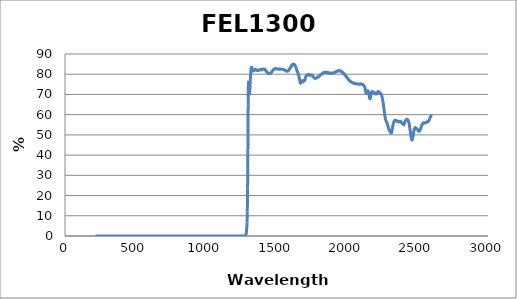
| Category | Series 0 |
|---|---|
| 2600.0 | 59.969 |
| 2599.0 | 59.881 |
| 2598.0 | 59.73 |
| 2597.0 | 59.598 |
| 2596.0 | 59.55 |
| 2595.0 | 59.393 |
| 2594.0 | 59.216 |
| 2593.0 | 59.158 |
| 2592.0 | 58.929 |
| 2591.0 | 58.817 |
| 2590.0 | 58.673 |
| 2589.0 | 58.438 |
| 2588.0 | 58.28 |
| 2587.0 | 58.122 |
| 2586.0 | 57.94 |
| 2585.0 | 57.652 |
| 2584.0 | 57.515 |
| 2583.0 | 57.382 |
| 2582.0 | 57.18 |
| 2581.0 | 57.008 |
| 2580.0 | 56.965 |
| 2579.0 | 56.839 |
| 2578.0 | 56.712 |
| 2577.0 | 56.682 |
| 2576.0 | 56.674 |
| 2575.0 | 56.623 |
| 2574.0 | 56.578 |
| 2573.0 | 56.587 |
| 2572.0 | 56.563 |
| 2571.0 | 56.522 |
| 2570.0 | 56.507 |
| 2569.0 | 56.46 |
| 2568.0 | 56.471 |
| 2567.0 | 56.363 |
| 2566.0 | 56.339 |
| 2565.0 | 56.24 |
| 2564.0 | 56.202 |
| 2563.0 | 56.131 |
| 2562.0 | 56.168 |
| 2561.0 | 56.062 |
| 2560.0 | 55.98 |
| 2559.0 | 56.016 |
| 2558.0 | 55.999 |
| 2557.0 | 55.931 |
| 2556.0 | 55.889 |
| 2555.0 | 55.826 |
| 2554.0 | 55.826 |
| 2553.0 | 55.825 |
| 2552.0 | 55.808 |
| 2551.0 | 55.839 |
| 2550.0 | 55.875 |
| 2549.0 | 55.958 |
| 2548.0 | 55.997 |
| 2547.0 | 56.031 |
| 2546.0 | 56.074 |
| 2545.0 | 55.976 |
| 2544.0 | 56.022 |
| 2543.0 | 55.931 |
| 2542.0 | 55.96 |
| 2541.0 | 55.912 |
| 2540.0 | 55.892 |
| 2539.0 | 55.846 |
| 2538.0 | 55.738 |
| 2537.0 | 55.578 |
| 2536.0 | 55.539 |
| 2535.0 | 55.359 |
| 2534.0 | 55.228 |
| 2533.0 | 55.102 |
| 2532.0 | 55.036 |
| 2531.0 | 54.741 |
| 2530.0 | 54.552 |
| 2529.0 | 54.396 |
| 2528.0 | 54.183 |
| 2527.0 | 53.971 |
| 2526.0 | 53.848 |
| 2525.0 | 53.608 |
| 2524.0 | 53.431 |
| 2523.0 | 53.211 |
| 2522.0 | 53.046 |
| 2521.0 | 52.83 |
| 2520.0 | 52.625 |
| 2519.0 | 52.514 |
| 2518.0 | 52.347 |
| 2517.0 | 52.14 |
| 2516.0 | 52.04 |
| 2515.0 | 51.996 |
| 2514.0 | 51.841 |
| 2513.0 | 51.81 |
| 2512.0 | 51.82 |
| 2511.0 | 51.808 |
| 2510.0 | 51.718 |
| 2509.0 | 51.867 |
| 2508.0 | 51.843 |
| 2507.0 | 51.906 |
| 2506.0 | 52 |
| 2505.0 | 52.163 |
| 2504.0 | 52.18 |
| 2503.0 | 52.311 |
| 2502.0 | 52.445 |
| 2501.0 | 52.564 |
| 2500.0 | 52.611 |
| 2499.0 | 52.815 |
| 2498.0 | 52.798 |
| 2497.0 | 52.827 |
| 2496.0 | 52.943 |
| 2495.0 | 53.031 |
| 2494.0 | 53.077 |
| 2493.0 | 53.136 |
| 2492.0 | 53.252 |
| 2491.0 | 53.287 |
| 2490.0 | 53.289 |
| 2489.0 | 53.346 |
| 2488.0 | 53.459 |
| 2487.0 | 53.51 |
| 2486.0 | 53.574 |
| 2485.0 | 53.62 |
| 2484.0 | 53.605 |
| 2483.0 | 53.625 |
| 2482.0 | 53.554 |
| 2481.0 | 53.421 |
| 2480.0 | 53.341 |
| 2479.0 | 53.196 |
| 2478.0 | 52.953 |
| 2477.0 | 52.672 |
| 2476.0 | 52.394 |
| 2475.0 | 52.086 |
| 2474.0 | 51.713 |
| 2473.0 | 51.368 |
| 2472.0 | 50.954 |
| 2471.0 | 50.538 |
| 2470.0 | 50.138 |
| 2469.0 | 49.689 |
| 2468.0 | 49.165 |
| 2467.0 | 48.781 |
| 2466.0 | 48.403 |
| 2465.0 | 48.04 |
| 2464.0 | 47.715 |
| 2463.0 | 47.569 |
| 2462.0 | 47.487 |
| 2461.0 | 47.418 |
| 2460.0 | 47.554 |
| 2459.0 | 47.681 |
| 2458.0 | 47.966 |
| 2457.0 | 48.254 |
| 2456.0 | 48.638 |
| 2455.0 | 48.997 |
| 2454.0 | 49.402 |
| 2453.0 | 49.834 |
| 2452.0 | 50.287 |
| 2451.0 | 50.713 |
| 2450.0 | 51.224 |
| 2449.0 | 51.66 |
| 2448.0 | 52.128 |
| 2447.0 | 52.722 |
| 2446.0 | 53.116 |
| 2445.0 | 53.648 |
| 2444.0 | 54.1 |
| 2443.0 | 54.54 |
| 2442.0 | 54.976 |
| 2441.0 | 55.451 |
| 2440.0 | 55.752 |
| 2439.0 | 56.04 |
| 2438.0 | 56.332 |
| 2437.0 | 56.609 |
| 2436.0 | 56.739 |
| 2435.0 | 56.986 |
| 2434.0 | 57.193 |
| 2433.0 | 57.212 |
| 2432.0 | 57.391 |
| 2431.0 | 57.506 |
| 2430.0 | 57.528 |
| 2429.0 | 57.62 |
| 2428.0 | 57.69 |
| 2427.0 | 57.651 |
| 2426.0 | 57.628 |
| 2425.0 | 57.659 |
| 2424.0 | 57.682 |
| 2423.0 | 57.717 |
| 2422.0 | 57.6 |
| 2421.0 | 57.593 |
| 2420.0 | 57.501 |
| 2419.0 | 57.502 |
| 2418.0 | 57.408 |
| 2417.0 | 57.316 |
| 2416.0 | 57.279 |
| 2415.0 | 57.061 |
| 2414.0 | 56.941 |
| 2413.0 | 56.831 |
| 2412.0 | 56.753 |
| 2411.0 | 56.402 |
| 2410.0 | 56.225 |
| 2409.0 | 56.08 |
| 2408.0 | 55.809 |
| 2407.0 | 55.649 |
| 2406.0 | 55.461 |
| 2405.0 | 55.254 |
| 2404.0 | 55.143 |
| 2403.0 | 55.179 |
| 2402.0 | 55.009 |
| 2401.0 | 54.996 |
| 2400.0 | 55.071 |
| 2399.0 | 55.084 |
| 2398.0 | 55.107 |
| 2397.0 | 55.284 |
| 2396.0 | 55.353 |
| 2395.0 | 55.404 |
| 2394.0 | 55.53 |
| 2393.0 | 55.628 |
| 2392.0 | 55.642 |
| 2391.0 | 55.814 |
| 2390.0 | 55.858 |
| 2389.0 | 55.914 |
| 2388.0 | 56.049 |
| 2387.0 | 56.158 |
| 2386.0 | 56.114 |
| 2385.0 | 56.288 |
| 2384.0 | 56.421 |
| 2383.0 | 56.459 |
| 2382.0 | 56.555 |
| 2381.0 | 56.591 |
| 2380.0 | 56.628 |
| 2379.0 | 56.674 |
| 2378.0 | 56.691 |
| 2377.0 | 56.629 |
| 2376.0 | 56.725 |
| 2375.0 | 56.66 |
| 2374.0 | 56.6 |
| 2373.0 | 56.571 |
| 2372.0 | 56.53 |
| 2371.0 | 56.527 |
| 2370.0 | 56.528 |
| 2369.0 | 56.522 |
| 2368.0 | 56.47 |
| 2367.0 | 56.42 |
| 2366.0 | 56.502 |
| 2365.0 | 56.384 |
| 2364.0 | 56.523 |
| 2363.0 | 56.466 |
| 2362.0 | 56.601 |
| 2361.0 | 56.736 |
| 2360.0 | 56.739 |
| 2359.0 | 56.825 |
| 2358.0 | 56.879 |
| 2357.0 | 56.858 |
| 2356.0 | 56.912 |
| 2355.0 | 56.93 |
| 2354.0 | 56.921 |
| 2353.0 | 56.835 |
| 2352.0 | 56.844 |
| 2351.0 | 56.839 |
| 2350.0 | 56.826 |
| 2349.0 | 56.857 |
| 2348.0 | 56.841 |
| 2347.0 | 56.968 |
| 2346.0 | 57.049 |
| 2345.0 | 57.121 |
| 2344.0 | 57.105 |
| 2343.0 | 57.267 |
| 2342.0 | 57.253 |
| 2341.0 | 57.324 |
| 2340.0 | 57.31 |
| 2339.0 | 57.293 |
| 2338.0 | 57.146 |
| 2337.0 | 57.105 |
| 2336.0 | 56.93 |
| 2335.0 | 56.838 |
| 2334.0 | 56.724 |
| 2333.0 | 56.464 |
| 2332.0 | 56.27 |
| 2331.0 | 56.139 |
| 2330.0 | 55.802 |
| 2329.0 | 55.636 |
| 2328.0 | 55.382 |
| 2327.0 | 55.04 |
| 2326.0 | 54.762 |
| 2325.0 | 54.46 |
| 2324.0 | 54.118 |
| 2323.0 | 53.642 |
| 2322.0 | 53.301 |
| 2321.0 | 52.89 |
| 2320.0 | 52.414 |
| 2319.0 | 51.984 |
| 2318.0 | 51.565 |
| 2317.0 | 51.31 |
| 2316.0 | 51.159 |
| 2315.0 | 50.936 |
| 2314.0 | 50.887 |
| 2313.0 | 50.953 |
| 2312.0 | 50.926 |
| 2311.0 | 51.038 |
| 2310.0 | 51.211 |
| 2309.0 | 51.347 |
| 2308.0 | 51.533 |
| 2307.0 | 51.675 |
| 2306.0 | 51.716 |
| 2305.0 | 51.837 |
| 2304.0 | 51.906 |
| 2303.0 | 51.989 |
| 2302.0 | 52.013 |
| 2301.0 | 52.113 |
| 2300.0 | 52.308 |
| 2299.0 | 52.415 |
| 2298.0 | 52.597 |
| 2297.0 | 52.75 |
| 2296.0 | 52.993 |
| 2295.0 | 53.185 |
| 2294.0 | 53.425 |
| 2293.0 | 53.714 |
| 2292.0 | 53.908 |
| 2291.0 | 54.099 |
| 2290.0 | 54.334 |
| 2289.0 | 54.631 |
| 2288.0 | 54.783 |
| 2287.0 | 55.038 |
| 2286.0 | 55.403 |
| 2285.0 | 55.545 |
| 2284.0 | 55.864 |
| 2283.0 | 56.07 |
| 2282.0 | 56.218 |
| 2281.0 | 56.395 |
| 2280.0 | 56.561 |
| 2279.0 | 56.754 |
| 2278.0 | 56.817 |
| 2277.0 | 56.964 |
| 2276.0 | 57.126 |
| 2275.0 | 57.29 |
| 2274.0 | 57.531 |
| 2273.0 | 57.634 |
| 2272.0 | 58.067 |
| 2271.0 | 58.399 |
| 2270.0 | 58.848 |
| 2269.0 | 59.321 |
| 2268.0 | 59.822 |
| 2267.0 | 60.354 |
| 2266.0 | 60.877 |
| 2265.0 | 61.377 |
| 2264.0 | 61.885 |
| 2263.0 | 62.459 |
| 2262.0 | 62.98 |
| 2261.0 | 63.456 |
| 2260.0 | 63.956 |
| 2259.0 | 64.472 |
| 2258.0 | 64.94 |
| 2257.0 | 65.474 |
| 2256.0 | 65.904 |
| 2255.0 | 66.341 |
| 2254.0 | 66.748 |
| 2253.0 | 67.136 |
| 2252.0 | 67.53 |
| 2251.0 | 67.98 |
| 2250.0 | 68.345 |
| 2249.0 | 68.632 |
| 2248.0 | 68.917 |
| 2247.0 | 69.092 |
| 2246.0 | 69.386 |
| 2245.0 | 69.613 |
| 2244.0 | 69.781 |
| 2243.0 | 69.989 |
| 2242.0 | 70.102 |
| 2241.0 | 70.169 |
| 2240.0 | 70.397 |
| 2239.0 | 70.382 |
| 2238.0 | 70.424 |
| 2237.0 | 70.564 |
| 2236.0 | 70.636 |
| 2235.0 | 70.639 |
| 2234.0 | 70.618 |
| 2233.0 | 70.693 |
| 2232.0 | 70.813 |
| 2231.0 | 70.858 |
| 2230.0 | 70.792 |
| 2229.0 | 70.94 |
| 2228.0 | 71.023 |
| 2227.0 | 71.114 |
| 2226.0 | 71.276 |
| 2225.0 | 71.306 |
| 2224.0 | 71.294 |
| 2223.0 | 71.326 |
| 2222.0 | 71.406 |
| 2221.0 | 71.423 |
| 2220.0 | 71.272 |
| 2219.0 | 71.255 |
| 2218.0 | 71.136 |
| 2217.0 | 71.082 |
| 2216.0 | 70.953 |
| 2215.0 | 70.836 |
| 2214.0 | 70.647 |
| 2213.0 | 70.665 |
| 2212.0 | 70.352 |
| 2211.0 | 70.319 |
| 2210.0 | 70.296 |
| 2209.0 | 70.214 |
| 2208.0 | 70.191 |
| 2207.0 | 70.259 |
| 2206.0 | 70.248 |
| 2205.0 | 70.17 |
| 2204.0 | 70.314 |
| 2203.0 | 70.418 |
| 2202.0 | 70.514 |
| 2201.0 | 70.572 |
| 2200.0 | 70.615 |
| 2199.0 | 70.707 |
| 2198.0 | 70.735 |
| 2197.0 | 70.81 |
| 2196.0 | 70.78 |
| 2195.0 | 70.81 |
| 2194.0 | 70.731 |
| 2193.0 | 70.661 |
| 2192.0 | 70.802 |
| 2191.0 | 70.734 |
| 2190.0 | 70.803 |
| 2189.0 | 70.741 |
| 2188.0 | 70.766 |
| 2187.0 | 70.849 |
| 2186.0 | 70.996 |
| 2185.0 | 71.001 |
| 2184.0 | 71.2 |
| 2183.0 | 71.262 |
| 2182.0 | 71.385 |
| 2181.0 | 71.414 |
| 2180.0 | 71.458 |
| 2179.0 | 71.514 |
| 2178.0 | 71.448 |
| 2177.0 | 71.501 |
| 2176.0 | 71.399 |
| 2175.0 | 71.212 |
| 2174.0 | 71.137 |
| 2173.0 | 70.873 |
| 2172.0 | 70.652 |
| 2171.0 | 70.311 |
| 2170.0 | 69.865 |
| 2169.0 | 69.489 |
| 2168.0 | 69.051 |
| 2167.0 | 68.644 |
| 2166.0 | 68.31 |
| 2165.0 | 68.027 |
| 2164.0 | 67.956 |
| 2163.0 | 67.861 |
| 2162.0 | 67.923 |
| 2161.0 | 68.032 |
| 2160.0 | 68.352 |
| 2159.0 | 68.712 |
| 2158.0 | 69.066 |
| 2157.0 | 69.527 |
| 2156.0 | 69.864 |
| 2155.0 | 70.207 |
| 2154.0 | 70.593 |
| 2153.0 | 70.908 |
| 2152.0 | 71.263 |
| 2151.0 | 71.506 |
| 2150.0 | 71.649 |
| 2149.0 | 71.786 |
| 2148.0 | 71.821 |
| 2147.0 | 71.882 |
| 2146.0 | 71.816 |
| 2145.0 | 71.86 |
| 2144.0 | 71.563 |
| 2143.0 | 71.458 |
| 2142.0 | 71.29 |
| 2141.0 | 71.172 |
| 2140.0 | 70.888 |
| 2139.0 | 70.844 |
| 2138.0 | 70.66 |
| 2137.0 | 70.565 |
| 2136.0 | 70.716 |
| 2135.0 | 70.622 |
| 2134.0 | 70.911 |
| 2133.0 | 71.249 |
| 2132.0 | 71.561 |
| 2131.0 | 71.796 |
| 2130.0 | 72.286 |
| 2129.0 | 72.625 |
| 2128.0 | 72.97 |
| 2127.0 | 73.278 |
| 2126.0 | 73.473 |
| 2125.0 | 73.698 |
| 2124.0 | 73.828 |
| 2123.0 | 74.011 |
| 2122.0 | 74.098 |
| 2121.0 | 74.22 |
| 2120.0 | 74.313 |
| 2119.0 | 74.359 |
| 2118.0 | 74.441 |
| 2117.0 | 74.503 |
| 2116.0 | 74.697 |
| 2115.0 | 74.636 |
| 2114.0 | 74.806 |
| 2113.0 | 74.778 |
| 2112.0 | 74.93 |
| 2111.0 | 74.891 |
| 2110.0 | 75.03 |
| 2109.0 | 75.008 |
| 2108.0 | 75.072 |
| 2107.0 | 75.053 |
| 2106.0 | 75.05 |
| 2105.0 | 75.085 |
| 2104.0 | 75.139 |
| 2103.0 | 75.116 |
| 2102.0 | 75.154 |
| 2101.0 | 75.107 |
| 2100.0 | 75.133 |
| 2099.0 | 75.205 |
| 2098.0 | 75.151 |
| 2097.0 | 75.154 |
| 2096.0 | 75.087 |
| 2095.0 | 75.245 |
| 2094.0 | 75.111 |
| 2093.0 | 75.194 |
| 2092.0 | 75.09 |
| 2091.0 | 75.184 |
| 2090.0 | 75.114 |
| 2089.0 | 75.167 |
| 2088.0 | 75.117 |
| 2087.0 | 75.091 |
| 2086.0 | 75.111 |
| 2085.0 | 75.056 |
| 2084.0 | 75.067 |
| 2083.0 | 75.103 |
| 2082.0 | 75.163 |
| 2081.0 | 75.096 |
| 2080.0 | 75.103 |
| 2079.0 | 75.083 |
| 2078.0 | 75.187 |
| 2077.0 | 75.208 |
| 2076.0 | 75.083 |
| 2075.0 | 75.153 |
| 2074.0 | 75.102 |
| 2073.0 | 75.18 |
| 2072.0 | 75.224 |
| 2071.0 | 75.246 |
| 2070.0 | 75.129 |
| 2069.0 | 75.234 |
| 2068.0 | 75.256 |
| 2067.0 | 75.183 |
| 2066.0 | 75.297 |
| 2065.0 | 75.359 |
| 2064.0 | 75.291 |
| 2063.0 | 75.336 |
| 2062.0 | 75.396 |
| 2061.0 | 75.291 |
| 2060.0 | 75.493 |
| 2059.0 | 75.372 |
| 2058.0 | 75.495 |
| 2057.0 | 75.434 |
| 2056.0 | 75.488 |
| 2055.0 | 75.401 |
| 2054.0 | 75.448 |
| 2053.0 | 75.423 |
| 2052.0 | 75.53 |
| 2051.0 | 75.505 |
| 2050.0 | 75.514 |
| 2049.0 | 75.503 |
| 2048.0 | 75.526 |
| 2047.0 | 75.716 |
| 2046.0 | 75.552 |
| 2045.0 | 75.541 |
| 2044.0 | 75.64 |
| 2043.0 | 75.621 |
| 2042.0 | 75.679 |
| 2041.0 | 75.716 |
| 2040.0 | 75.674 |
| 2039.0 | 75.799 |
| 2038.0 | 75.805 |
| 2037.0 | 75.828 |
| 2036.0 | 75.879 |
| 2035.0 | 76.019 |
| 2034.0 | 75.986 |
| 2033.0 | 76.041 |
| 2032.0 | 76.034 |
| 2031.0 | 76.092 |
| 2030.0 | 76.175 |
| 2029.0 | 76.255 |
| 2028.0 | 76.246 |
| 2027.0 | 76.29 |
| 2026.0 | 76.413 |
| 2025.0 | 76.437 |
| 2024.0 | 76.506 |
| 2023.0 | 76.428 |
| 2022.0 | 76.633 |
| 2021.0 | 76.644 |
| 2020.0 | 76.704 |
| 2019.0 | 76.738 |
| 2018.0 | 76.794 |
| 2017.0 | 76.879 |
| 2016.0 | 77.007 |
| 2015.0 | 77.032 |
| 2014.0 | 77.118 |
| 2013.0 | 77.159 |
| 2012.0 | 77.225 |
| 2011.0 | 77.346 |
| 2010.0 | 77.439 |
| 2009.0 | 77.482 |
| 2008.0 | 77.548 |
| 2007.0 | 77.676 |
| 2006.0 | 77.801 |
| 2005.0 | 77.948 |
| 2004.0 | 78.024 |
| 2003.0 | 77.966 |
| 2002.0 | 78.049 |
| 2001.0 | 78.204 |
| 2000.0 | 78.354 |
| 1999.0 | 78.502 |
| 1998.0 | 78.567 |
| 1997.0 | 78.533 |
| 1996.0 | 78.712 |
| 1995.0 | 78.824 |
| 1994.0 | 78.911 |
| 1993.0 | 78.959 |
| 1992.0 | 79.082 |
| 1991.0 | 79.234 |
| 1990.0 | 79.294 |
| 1989.0 | 79.382 |
| 1988.0 | 79.348 |
| 1987.0 | 79.557 |
| 1986.0 | 79.606 |
| 1985.0 | 79.744 |
| 1984.0 | 79.827 |
| 1983.0 | 79.857 |
| 1982.0 | 79.891 |
| 1981.0 | 80.123 |
| 1980.0 | 80.09 |
| 1979.0 | 80.183 |
| 1978.0 | 80.285 |
| 1977.0 | 80.217 |
| 1976.0 | 80.368 |
| 1975.0 | 80.43 |
| 1974.0 | 80.538 |
| 1973.0 | 80.537 |
| 1972.0 | 80.701 |
| 1971.0 | 80.721 |
| 1970.0 | 80.825 |
| 1969.0 | 80.778 |
| 1968.0 | 80.878 |
| 1967.0 | 81.014 |
| 1966.0 | 81.075 |
| 1965.0 | 81.106 |
| 1964.0 | 81.124 |
| 1963.0 | 81.254 |
| 1962.0 | 81.315 |
| 1961.0 | 81.343 |
| 1960.0 | 81.32 |
| 1959.0 | 81.432 |
| 1958.0 | 81.575 |
| 1957.0 | 81.514 |
| 1956.0 | 81.56 |
| 1955.0 | 81.655 |
| 1954.0 | 81.646 |
| 1953.0 | 81.665 |
| 1952.0 | 81.673 |
| 1951.0 | 81.667 |
| 1950.0 | 81.739 |
| 1949.0 | 81.786 |
| 1948.0 | 81.621 |
| 1947.0 | 81.695 |
| 1946.0 | 81.704 |
| 1945.0 | 81.709 |
| 1944.0 | 81.76 |
| 1943.0 | 81.647 |
| 1942.0 | 81.809 |
| 1941.0 | 81.653 |
| 1940.0 | 81.696 |
| 1939.0 | 81.705 |
| 1938.0 | 81.562 |
| 1937.0 | 81.655 |
| 1936.0 | 81.586 |
| 1935.0 | 81.665 |
| 1934.0 | 81.573 |
| 1933.0 | 81.566 |
| 1932.0 | 81.61 |
| 1931.0 | 81.513 |
| 1930.0 | 81.453 |
| 1929.0 | 81.437 |
| 1928.0 | 81.412 |
| 1927.0 | 81.449 |
| 1926.0 | 81.314 |
| 1925.0 | 81.28 |
| 1924.0 | 81.359 |
| 1923.0 | 81.254 |
| 1922.0 | 81.333 |
| 1921.0 | 81.171 |
| 1920.0 | 81.148 |
| 1919.0 | 81.205 |
| 1918.0 | 81.126 |
| 1917.0 | 81.052 |
| 1916.0 | 81.013 |
| 1915.0 | 81.046 |
| 1914.0 | 80.92 |
| 1913.0 | 80.877 |
| 1912.0 | 80.856 |
| 1911.0 | 80.856 |
| 1910.0 | 80.808 |
| 1909.0 | 80.833 |
| 1908.0 | 80.77 |
| 1907.0 | 80.666 |
| 1906.0 | 80.669 |
| 1905.0 | 80.602 |
| 1904.0 | 80.577 |
| 1903.0 | 80.623 |
| 1902.0 | 80.551 |
| 1901.0 | 80.525 |
| 1900.0 | 80.547 |
| 1899.0 | 80.542 |
| 1898.0 | 80.486 |
| 1897.0 | 80.575 |
| 1896.0 | 80.507 |
| 1895.0 | 80.535 |
| 1894.0 | 80.494 |
| 1893.0 | 80.601 |
| 1892.0 | 80.47 |
| 1891.0 | 80.564 |
| 1890.0 | 80.512 |
| 1889.0 | 80.591 |
| 1888.0 | 80.551 |
| 1887.0 | 80.531 |
| 1886.0 | 80.425 |
| 1885.0 | 80.548 |
| 1884.0 | 80.481 |
| 1883.0 | 80.466 |
| 1882.0 | 80.512 |
| 1881.0 | 80.532 |
| 1880.0 | 80.557 |
| 1879.0 | 80.528 |
| 1878.0 | 80.515 |
| 1877.0 | 80.439 |
| 1876.0 | 80.622 |
| 1875.0 | 80.615 |
| 1874.0 | 80.652 |
| 1873.0 | 80.642 |
| 1872.0 | 80.628 |
| 1871.0 | 80.579 |
| 1870.0 | 80.713 |
| 1869.0 | 80.625 |
| 1868.0 | 80.748 |
| 1867.0 | 80.735 |
| 1866.0 | 80.802 |
| 1865.0 | 80.85 |
| 1864.0 | 80.865 |
| 1863.0 | 80.902 |
| 1862.0 | 80.774 |
| 1861.0 | 80.872 |
| 1860.0 | 80.895 |
| 1859.0 | 80.951 |
| 1858.0 | 80.928 |
| 1857.0 | 80.976 |
| 1856.0 | 80.972 |
| 1855.0 | 80.918 |
| 1854.0 | 80.898 |
| 1853.0 | 80.981 |
| 1852.0 | 80.998 |
| 1851.0 | 80.907 |
| 1850.0 | 80.982 |
| 1849.0 | 80.897 |
| 1848.0 | 80.927 |
| 1847.0 | 80.962 |
| 1846.0 | 80.934 |
| 1845.0 | 81.036 |
| 1844.0 | 80.905 |
| 1843.0 | 80.829 |
| 1842.0 | 80.835 |
| 1841.0 | 80.913 |
| 1840.0 | 80.932 |
| 1839.0 | 80.863 |
| 1838.0 | 80.76 |
| 1837.0 | 80.913 |
| 1836.0 | 80.758 |
| 1835.0 | 80.683 |
| 1834.0 | 80.677 |
| 1833.0 | 80.623 |
| 1832.0 | 80.65 |
| 1831.0 | 80.476 |
| 1830.0 | 80.555 |
| 1829.0 | 80.517 |
| 1828.0 | 80.485 |
| 1827.0 | 80.267 |
| 1826.0 | 80.384 |
| 1825.0 | 80.282 |
| 1824.0 | 80.253 |
| 1823.0 | 80.256 |
| 1822.0 | 80.132 |
| 1821.0 | 80.145 |
| 1820.0 | 80.061 |
| 1819.0 | 80.033 |
| 1818.0 | 79.962 |
| 1817.0 | 79.819 |
| 1816.0 | 79.896 |
| 1815.0 | 79.701 |
| 1814.0 | 79.776 |
| 1813.0 | 79.689 |
| 1812.0 | 79.574 |
| 1811.0 | 79.593 |
| 1810.0 | 79.454 |
| 1809.0 | 79.487 |
| 1808.0 | 79.469 |
| 1807.0 | 79.271 |
| 1806.0 | 79.19 |
| 1805.0 | 79.074 |
| 1804.0 | 79.074 |
| 1803.0 | 79.044 |
| 1802.0 | 78.958 |
| 1801.0 | 78.867 |
| 1800.0 | 78.811 |
| 1799.0 | 78.865 |
| 1798.0 | 78.689 |
| 1797.0 | 78.694 |
| 1796.0 | 78.719 |
| 1795.0 | 78.588 |
| 1794.0 | 78.578 |
| 1793.0 | 78.526 |
| 1792.0 | 78.408 |
| 1791.0 | 78.354 |
| 1790.0 | 78.346 |
| 1789.0 | 78.39 |
| 1788.0 | 78.35 |
| 1787.0 | 78.204 |
| 1786.0 | 78.259 |
| 1785.0 | 78.151 |
| 1784.0 | 78.188 |
| 1783.0 | 78.157 |
| 1782.0 | 78.117 |
| 1781.0 | 78.109 |
| 1780.0 | 78.106 |
| 1779.0 | 78.05 |
| 1778.0 | 77.93 |
| 1777.0 | 77.984 |
| 1776.0 | 77.97 |
| 1775.0 | 77.986 |
| 1774.0 | 77.98 |
| 1773.0 | 77.992 |
| 1772.0 | 77.978 |
| 1771.0 | 77.945 |
| 1770.0 | 78.026 |
| 1769.0 | 78.082 |
| 1768.0 | 78.066 |
| 1767.0 | 78.112 |
| 1766.0 | 78.274 |
| 1765.0 | 78.264 |
| 1764.0 | 78.353 |
| 1763.0 | 78.52 |
| 1762.0 | 78.621 |
| 1761.0 | 78.69 |
| 1760.0 | 78.696 |
| 1759.0 | 78.87 |
| 1758.0 | 79.022 |
| 1757.0 | 79.07 |
| 1756.0 | 79.149 |
| 1755.0 | 79.259 |
| 1754.0 | 79.307 |
| 1753.0 | 79.31 |
| 1752.0 | 79.422 |
| 1751.0 | 79.426 |
| 1750.0 | 79.526 |
| 1749.0 | 79.627 |
| 1748.0 | 79.583 |
| 1747.0 | 79.488 |
| 1746.0 | 79.645 |
| 1745.0 | 79.582 |
| 1744.0 | 79.511 |
| 1743.0 | 79.552 |
| 1742.0 | 79.502 |
| 1741.0 | 79.432 |
| 1740.0 | 79.498 |
| 1739.0 | 79.396 |
| 1738.0 | 79.468 |
| 1737.0 | 79.495 |
| 1736.0 | 79.488 |
| 1735.0 | 79.584 |
| 1734.0 | 79.621 |
| 1733.0 | 79.637 |
| 1732.0 | 79.657 |
| 1731.0 | 79.835 |
| 1730.0 | 79.769 |
| 1729.0 | 79.824 |
| 1728.0 | 79.816 |
| 1727.0 | 79.785 |
| 1726.0 | 79.82 |
| 1725.0 | 79.709 |
| 1724.0 | 79.839 |
| 1723.0 | 79.715 |
| 1722.0 | 79.585 |
| 1721.0 | 79.578 |
| 1720.0 | 79.576 |
| 1719.0 | 79.608 |
| 1718.0 | 79.531 |
| 1717.0 | 79.607 |
| 1716.0 | 79.544 |
| 1715.0 | 79.511 |
| 1714.0 | 79.447 |
| 1713.0 | 79.405 |
| 1712.0 | 79.196 |
| 1711.0 | 79.146 |
| 1710.0 | 78.98 |
| 1709.0 | 78.798 |
| 1708.0 | 78.747 |
| 1707.0 | 78.462 |
| 1706.0 | 78.311 |
| 1705.0 | 78.043 |
| 1704.0 | 77.807 |
| 1703.0 | 77.544 |
| 1702.0 | 77.331 |
| 1701.0 | 77.108 |
| 1700.0 | 77.046 |
| 1699.0 | 76.858 |
| 1698.0 | 76.815 |
| 1697.0 | 76.97 |
| 1696.0 | 76.948 |
| 1695.0 | 76.898 |
| 1694.0 | 76.825 |
| 1693.0 | 76.761 |
| 1692.0 | 76.55 |
| 1691.0 | 76.486 |
| 1690.0 | 76.401 |
| 1689.0 | 76.297 |
| 1688.0 | 76.205 |
| 1687.0 | 76.29 |
| 1686.0 | 76.277 |
| 1685.0 | 76.453 |
| 1684.0 | 76.486 |
| 1683.0 | 76.615 |
| 1682.0 | 76.808 |
| 1681.0 | 76.795 |
| 1680.0 | 76.788 |
| 1679.0 | 76.739 |
| 1678.0 | 76.581 |
| 1677.0 | 76.484 |
| 1676.0 | 76.337 |
| 1675.0 | 76.076 |
| 1674.0 | 75.987 |
| 1673.0 | 75.799 |
| 1672.0 | 75.716 |
| 1671.0 | 75.521 |
| 1670.0 | 75.737 |
| 1669.0 | 75.721 |
| 1668.0 | 75.814 |
| 1667.0 | 76.116 |
| 1666.0 | 76.435 |
| 1665.0 | 76.959 |
| 1664.0 | 77.21 |
| 1663.0 | 77.647 |
| 1662.0 | 78.065 |
| 1661.0 | 78.425 |
| 1660.0 | 78.728 |
| 1659.0 | 79.022 |
| 1658.0 | 79.3 |
| 1657.0 | 79.517 |
| 1656.0 | 79.822 |
| 1655.0 | 80.036 |
| 1654.0 | 80.256 |
| 1653.0 | 80.395 |
| 1652.0 | 80.564 |
| 1651.0 | 80.785 |
| 1650.0 | 80.836 |
| 1649.0 | 81.007 |
| 1648.0 | 81.204 |
| 1647.0 | 81.339 |
| 1646.0 | 81.705 |
| 1645.0 | 81.8 |
| 1644.0 | 82.093 |
| 1643.0 | 82.329 |
| 1642.0 | 82.685 |
| 1641.0 | 82.727 |
| 1640.0 | 83.076 |
| 1639.0 | 83.188 |
| 1638.0 | 83.399 |
| 1637.0 | 83.496 |
| 1636.0 | 83.629 |
| 1635.0 | 83.795 |
| 1634.0 | 83.924 |
| 1633.0 | 84.004 |
| 1632.0 | 84.121 |
| 1631.0 | 84.409 |
| 1630.0 | 84.48 |
| 1629.0 | 84.67 |
| 1628.0 | 84.61 |
| 1627.0 | 84.776 |
| 1626.0 | 84.788 |
| 1625.0 | 84.891 |
| 1624.0 | 85.037 |
| 1623.0 | 84.917 |
| 1622.0 | 84.952 |
| 1621.0 | 84.916 |
| 1620.0 | 84.977 |
| 1619.0 | 84.983 |
| 1618.0 | 84.847 |
| 1617.0 | 84.806 |
| 1616.0 | 84.866 |
| 1615.0 | 84.808 |
| 1614.0 | 84.818 |
| 1613.0 | 84.726 |
| 1612.0 | 84.706 |
| 1611.0 | 84.56 |
| 1610.0 | 84.571 |
| 1609.0 | 84.469 |
| 1608.0 | 84.352 |
| 1607.0 | 84.188 |
| 1606.0 | 84.091 |
| 1605.0 | 83.905 |
| 1604.0 | 83.885 |
| 1603.0 | 83.749 |
| 1602.0 | 83.741 |
| 1601.0 | 83.523 |
| 1600.0 | 83.461 |
| 1599.0 | 83.303 |
| 1598.0 | 83.192 |
| 1597.0 | 83.088 |
| 1596.0 | 82.869 |
| 1595.0 | 82.789 |
| 1594.0 | 82.834 |
| 1593.0 | 82.642 |
| 1592.0 | 82.41 |
| 1591.0 | 82.404 |
| 1590.0 | 82.285 |
| 1589.0 | 82.211 |
| 1588.0 | 82.04 |
| 1587.0 | 81.944 |
| 1586.0 | 81.84 |
| 1585.0 | 81.81 |
| 1584.0 | 81.735 |
| 1583.0 | 81.651 |
| 1582.0 | 81.638 |
| 1581.0 | 81.655 |
| 1580.0 | 81.552 |
| 1579.0 | 81.507 |
| 1578.0 | 81.447 |
| 1577.0 | 81.52 |
| 1576.0 | 81.488 |
| 1575.0 | 81.467 |
| 1574.0 | 81.524 |
| 1573.0 | 81.547 |
| 1572.0 | 81.41 |
| 1571.0 | 81.554 |
| 1570.0 | 81.615 |
| 1569.0 | 81.572 |
| 1568.0 | 81.57 |
| 1567.0 | 81.612 |
| 1566.0 | 81.668 |
| 1565.0 | 81.743 |
| 1564.0 | 81.792 |
| 1563.0 | 81.703 |
| 1562.0 | 81.876 |
| 1561.0 | 81.877 |
| 1560.0 | 81.929 |
| 1559.0 | 82 |
| 1558.0 | 81.982 |
| 1557.0 | 82.115 |
| 1556.0 | 82.138 |
| 1555.0 | 82.117 |
| 1554.0 | 82.154 |
| 1553.0 | 82.233 |
| 1552.0 | 82.273 |
| 1551.0 | 82.342 |
| 1550.0 | 82.352 |
| 1549.0 | 82.293 |
| 1548.0 | 82.397 |
| 1547.0 | 82.425 |
| 1546.0 | 82.402 |
| 1545.0 | 82.361 |
| 1544.0 | 82.452 |
| 1543.0 | 82.421 |
| 1542.0 | 82.407 |
| 1541.0 | 82.428 |
| 1540.0 | 82.452 |
| 1539.0 | 82.471 |
| 1538.0 | 82.428 |
| 1537.0 | 82.482 |
| 1536.0 | 82.515 |
| 1535.0 | 82.478 |
| 1534.0 | 82.521 |
| 1533.0 | 82.452 |
| 1532.0 | 82.535 |
| 1531.0 | 82.501 |
| 1530.0 | 82.562 |
| 1529.0 | 82.561 |
| 1528.0 | 82.535 |
| 1527.0 | 82.514 |
| 1526.0 | 82.513 |
| 1525.0 | 82.519 |
| 1524.0 | 82.55 |
| 1523.0 | 82.569 |
| 1522.0 | 82.489 |
| 1521.0 | 82.529 |
| 1520.0 | 82.541 |
| 1519.0 | 82.606 |
| 1518.0 | 82.545 |
| 1517.0 | 82.526 |
| 1516.0 | 82.61 |
| 1515.0 | 82.463 |
| 1514.0 | 82.467 |
| 1513.0 | 82.53 |
| 1512.0 | 82.545 |
| 1511.0 | 82.54 |
| 1510.0 | 82.55 |
| 1509.0 | 82.559 |
| 1508.0 | 82.574 |
| 1507.0 | 82.618 |
| 1506.0 | 82.593 |
| 1505.0 | 82.546 |
| 1504.0 | 82.538 |
| 1503.0 | 82.71 |
| 1502.0 | 82.667 |
| 1501.0 | 82.757 |
| 1500.0 | 82.63 |
| 1499.0 | 82.715 |
| 1498.0 | 82.609 |
| 1497.0 | 82.727 |
| 1496.0 | 82.66 |
| 1495.0 | 82.806 |
| 1494.0 | 82.737 |
| 1493.0 | 82.685 |
| 1492.0 | 82.74 |
| 1491.0 | 82.624 |
| 1490.0 | 82.664 |
| 1489.0 | 82.653 |
| 1488.0 | 82.687 |
| 1487.0 | 82.639 |
| 1486.0 | 82.56 |
| 1485.0 | 82.547 |
| 1484.0 | 82.578 |
| 1483.0 | 82.427 |
| 1482.0 | 82.559 |
| 1481.0 | 82.311 |
| 1480.0 | 82.283 |
| 1479.0 | 82.262 |
| 1478.0 | 82.176 |
| 1477.0 | 82.132 |
| 1476.0 | 82.1 |
| 1475.0 | 82.011 |
| 1474.0 | 81.88 |
| 1473.0 | 81.764 |
| 1472.0 | 81.723 |
| 1471.0 | 81.475 |
| 1470.0 | 81.501 |
| 1469.0 | 81.342 |
| 1468.0 | 81.413 |
| 1467.0 | 81.268 |
| 1466.0 | 81.118 |
| 1465.0 | 80.946 |
| 1464.0 | 80.968 |
| 1463.0 | 80.967 |
| 1462.0 | 80.744 |
| 1461.0 | 80.667 |
| 1460.0 | 80.707 |
| 1459.0 | 80.607 |
| 1458.0 | 80.528 |
| 1457.0 | 80.452 |
| 1456.0 | 80.412 |
| 1455.0 | 80.363 |
| 1454.0 | 80.421 |
| 1453.0 | 80.248 |
| 1452.0 | 80.336 |
| 1451.0 | 80.24 |
| 1450.0 | 80.32 |
| 1449.0 | 80.289 |
| 1448.0 | 80.304 |
| 1447.0 | 80.445 |
| 1446.0 | 80.298 |
| 1445.0 | 80.478 |
| 1444.0 | 80.361 |
| 1443.0 | 80.526 |
| 1442.0 | 80.484 |
| 1441.0 | 80.577 |
| 1440.0 | 80.605 |
| 1439.0 | 80.697 |
| 1438.0 | 80.713 |
| 1437.0 | 80.77 |
| 1436.0 | 80.866 |
| 1435.0 | 80.891 |
| 1434.0 | 80.888 |
| 1433.0 | 81.033 |
| 1432.0 | 81.109 |
| 1431.0 | 81.112 |
| 1430.0 | 81.162 |
| 1429.0 | 81.224 |
| 1428.0 | 81.364 |
| 1427.0 | 81.508 |
| 1426.0 | 81.644 |
| 1425.0 | 81.674 |
| 1424.0 | 81.716 |
| 1423.0 | 81.866 |
| 1422.0 | 81.88 |
| 1421.0 | 82.119 |
| 1420.0 | 82.251 |
| 1419.0 | 82.303 |
| 1418.0 | 82.375 |
| 1417.0 | 82.394 |
| 1416.0 | 82.545 |
| 1415.0 | 82.548 |
| 1414.0 | 82.59 |
| 1413.0 | 82.589 |
| 1412.0 | 82.539 |
| 1411.0 | 82.611 |
| 1410.0 | 82.582 |
| 1409.0 | 82.621 |
| 1408.0 | 82.629 |
| 1407.0 | 82.523 |
| 1406.0 | 82.629 |
| 1405.0 | 82.455 |
| 1404.0 | 82.485 |
| 1403.0 | 82.481 |
| 1402.0 | 82.463 |
| 1401.0 | 82.396 |
| 1400.0 | 82.428 |
| 1399.0 | 82.343 |
| 1398.0 | 82.362 |
| 1397.0 | 82.192 |
| 1396.0 | 82.108 |
| 1395.0 | 82.266 |
| 1394.0 | 82.315 |
| 1393.0 | 82.194 |
| 1392.0 | 82.147 |
| 1391.0 | 82.336 |
| 1390.0 | 82.224 |
| 1389.0 | 82.24 |
| 1388.0 | 82.243 |
| 1387.0 | 82.327 |
| 1386.0 | 82.288 |
| 1385.0 | 82.238 |
| 1384.0 | 82.248 |
| 1383.0 | 82.189 |
| 1382.0 | 82.22 |
| 1381.0 | 82.137 |
| 1380.0 | 82.212 |
| 1379.0 | 82 |
| 1378.0 | 82.078 |
| 1377.0 | 82.034 |
| 1376.0 | 82.023 |
| 1375.0 | 82.043 |
| 1374.0 | 82.014 |
| 1373.0 | 81.878 |
| 1372.0 | 81.899 |
| 1371.0 | 81.895 |
| 1370.0 | 81.884 |
| 1369.0 | 81.835 |
| 1368.0 | 81.817 |
| 1367.0 | 81.798 |
| 1366.0 | 81.854 |
| 1365.0 | 81.823 |
| 1364.0 | 81.857 |
| 1363.0 | 81.919 |
| 1362.0 | 81.827 |
| 1361.0 | 81.843 |
| 1360.0 | 81.957 |
| 1359.0 | 81.984 |
| 1358.0 | 81.972 |
| 1357.0 | 82.141 |
| 1356.0 | 82.164 |
| 1355.0 | 82.153 |
| 1354.0 | 82.327 |
| 1353.0 | 82.286 |
| 1352.0 | 82.398 |
| 1351.0 | 82.497 |
| 1350.0 | 82.4 |
| 1349.0 | 82.445 |
| 1348.0 | 82.388 |
| 1347.0 | 82.495 |
| 1346.0 | 82.391 |
| 1345.0 | 82.348 |
| 1344.0 | 82.215 |
| 1343.0 | 82.128 |
| 1342.0 | 82.048 |
| 1341.0 | 81.985 |
| 1340.0 | 81.88 |
| 1339.0 | 81.776 |
| 1338.0 | 81.719 |
| 1337.0 | 81.595 |
| 1336.0 | 81.585 |
| 1335.0 | 81.618 |
| 1334.0 | 81.568 |
| 1333.0 | 81.645 |
| 1332.0 | 81.694 |
| 1331.0 | 81.889 |
| 1330.0 | 82.165 |
| 1329.0 | 82.269 |
| 1328.0 | 82.533 |
| 1327.0 | 82.834 |
| 1326.0 | 82.994 |
| 1325.0 | 83.212 |
| 1324.0 | 83.416 |
| 1323.0 | 83.437 |
| 1322.0 | 83.413 |
| 1321.0 | 83.226 |
| 1320.0 | 82.904 |
| 1319.0 | 82.303 |
| 1318.0 | 81.52 |
| 1317.0 | 80.481 |
| 1316.0 | 79.381 |
| 1315.0 | 78.034 |
| 1314.0 | 76.608 |
| 1313.0 | 75.149 |
| 1312.0 | 73.695 |
| 1311.0 | 72.493 |
| 1310.0 | 71.403 |
| 1309.0 | 70.645 |
| 1308.0 | 70.322 |
| 1307.0 | 70.494 |
| 1306.0 | 71.235 |
| 1305.0 | 72.36 |
| 1304.0 | 74.027 |
| 1303.0 | 75.629 |
| 1302.0 | 76.702 |
| 1301.0 | 75.863 |
| 1300.0 | 72.164 |
| 1299.0 | 64.441 |
| 1298.0 | 54.349 |
| 1297.0 | 42.724 |
| 1296.0 | 32.177 |
| 1295.0 | 23.547 |
| 1294.0 | 16.839 |
| 1293.0 | 12.077 |
| 1292.0 | 8.857 |
| 1291.0 | 6.651 |
| 1290.0 | 5.034 |
| 1289.0 | 3.962 |
| 1288.0 | 3.094 |
| 1287.0 | 2.338 |
| 1286.0 | 1.687 |
| 1285.0 | 1.227 |
| 1284.0 | 0.897 |
| 1283.0 | 0.66 |
| 1282.0 | 0.495 |
| 1281.0 | 0.369 |
| 1280.0 | 0.279 |
| 1279.0 | 0.215 |
| 1278.0 | 0.166 |
| 1277.0 | 0.129 |
| 1276.0 | 0.101 |
| 1275.0 | 0.08 |
| 1274.0 | 0.063 |
| 1273.0 | 0.05 |
| 1272.0 | 0.04 |
| 1271.0 | 0.032 |
| 1270.0 | 0.026 |
| 1269.0 | 0.021 |
| 1268.0 | 0.017 |
| 1267.0 | 0.014 |
| 1266.0 | 0.011 |
| 1265.0 | 0.009 |
| 1264.0 | 0.008 |
| 1263.0 | 0.007 |
| 1262.0 | 0.006 |
| 1261.0 | 0.005 |
| 1260.0 | 0.004 |
| 1259.0 | 0.003 |
| 1258.0 | 0.003 |
| 1257.0 | 0.002 |
| 1256.0 | 0.002 |
| 1255.0 | 0.002 |
| 1254.0 | 0.002 |
| 1253.0 | 0.001 |
| 1252.0 | 0.001 |
| 1251.0 | 0.001 |
| 1250.0 | 0.001 |
| 1249.0 | 0.001 |
| 1248.0 | 0.001 |
| 1247.0 | 0.001 |
| 1246.0 | 0.001 |
| 1245.0 | 0.001 |
| 1244.0 | 0 |
| 1243.0 | 0.001 |
| 1242.0 | 0 |
| 1241.0 | 0 |
| 1240.0 | 0 |
| 1239.0 | 0 |
| 1238.0 | 0 |
| 1237.0 | 0 |
| 1236.0 | 0 |
| 1235.0 | 0 |
| 1234.0 | 0 |
| 1233.0 | 0 |
| 1232.0 | 0 |
| 1231.0 | 0 |
| 1230.0 | 0 |
| 1229.0 | 0 |
| 1228.0 | 0 |
| 1227.0 | 0 |
| 1226.0 | 0 |
| 1225.0 | 0 |
| 1224.0 | 0 |
| 1223.0 | 0 |
| 1222.0 | 0 |
| 1221.0 | 0 |
| 1220.0 | 0 |
| 1219.0 | 0 |
| 1218.0 | 0 |
| 1217.0 | 0 |
| 1216.0 | 0 |
| 1215.0 | 0 |
| 1214.0 | 0 |
| 1213.0 | 0 |
| 1212.0 | 0 |
| 1211.0 | 0 |
| 1210.0 | 0 |
| 1209.0 | 0 |
| 1208.0 | 0 |
| 1207.0 | 0 |
| 1206.0 | 0 |
| 1205.0 | 0 |
| 1204.0 | 0 |
| 1203.0 | 0 |
| 1202.0 | 0 |
| 1201.0 | 0 |
| 1200.0 | 0 |
| 1199.0 | 0 |
| 1198.0 | 0 |
| 1197.0 | 0 |
| 1196.0 | 0 |
| 1195.0 | 0 |
| 1194.0 | 0 |
| 1193.0 | 0 |
| 1192.0 | 0 |
| 1191.0 | 0 |
| 1190.0 | 0 |
| 1189.0 | 0 |
| 1188.0 | 0 |
| 1187.0 | 0 |
| 1186.0 | 0 |
| 1185.0 | 0 |
| 1184.0 | 0 |
| 1183.0 | 0 |
| 1182.0 | 0 |
| 1181.0 | 0 |
| 1180.0 | 0 |
| 1179.0 | 0 |
| 1178.0 | 0 |
| 1177.0 | 0 |
| 1176.0 | 0 |
| 1175.0 | 0 |
| 1174.0 | 0 |
| 1173.0 | 0 |
| 1172.0 | 0 |
| 1171.0 | 0 |
| 1170.0 | 0 |
| 1169.0 | 0 |
| 1168.0 | 0 |
| 1167.0 | 0 |
| 1166.0 | 0 |
| 1165.0 | 0 |
| 1164.0 | 0 |
| 1163.0 | 0 |
| 1162.0 | 0 |
| 1161.0 | 0 |
| 1160.0 | 0 |
| 1159.0 | 0 |
| 1158.0 | 0 |
| 1157.0 | 0 |
| 1156.0 | 0 |
| 1155.0 | 0 |
| 1154.0 | 0 |
| 1153.0 | 0 |
| 1152.0 | 0 |
| 1151.0 | 0 |
| 1150.0 | 0 |
| 1149.0 | 0 |
| 1148.0 | 0 |
| 1147.0 | 0 |
| 1146.0 | 0 |
| 1145.0 | 0 |
| 1144.0 | 0 |
| 1143.0 | 0 |
| 1142.0 | 0 |
| 1141.0 | 0 |
| 1140.0 | 0 |
| 1139.0 | 0 |
| 1138.0 | 0 |
| 1137.0 | 0 |
| 1136.0 | 0 |
| 1135.0 | 0 |
| 1134.0 | 0 |
| 1133.0 | 0 |
| 1132.0 | 0 |
| 1131.0 | 0 |
| 1130.0 | 0 |
| 1129.0 | 0 |
| 1128.0 | 0 |
| 1127.0 | 0 |
| 1126.0 | 0 |
| 1125.0 | 0 |
| 1124.0 | 0 |
| 1123.0 | 0 |
| 1122.0 | 0 |
| 1121.0 | 0 |
| 1120.0 | 0 |
| 1119.0 | 0 |
| 1118.0 | 0 |
| 1117.0 | 0 |
| 1116.0 | 0 |
| 1115.0 | 0 |
| 1114.0 | 0 |
| 1113.0 | 0 |
| 1112.0 | 0 |
| 1111.0 | 0 |
| 1110.0 | 0 |
| 1109.0 | 0 |
| 1108.0 | 0 |
| 1107.0 | 0 |
| 1106.0 | 0 |
| 1105.0 | 0 |
| 1104.0 | 0 |
| 1103.0 | 0 |
| 1102.0 | 0 |
| 1101.0 | 0 |
| 1100.0 | 0 |
| 1099.0 | 0 |
| 1098.0 | 0 |
| 1097.0 | 0 |
| 1096.0 | 0 |
| 1095.0 | 0 |
| 1094.0 | 0 |
| 1093.0 | 0 |
| 1092.0 | 0 |
| 1091.0 | 0 |
| 1090.0 | 0 |
| 1089.0 | 0 |
| 1088.0 | 0 |
| 1087.0 | 0 |
| 1086.0 | 0 |
| 1085.0 | 0 |
| 1084.0 | 0 |
| 1083.0 | 0 |
| 1082.0 | 0 |
| 1081.0 | 0 |
| 1080.0 | 0 |
| 1079.0 | 0 |
| 1078.0 | 0 |
| 1077.0 | 0 |
| 1076.0 | 0 |
| 1075.0 | 0 |
| 1074.0 | 0 |
| 1073.0 | 0 |
| 1072.0 | 0 |
| 1071.0 | 0 |
| 1070.0 | 0 |
| 1069.0 | 0 |
| 1068.0 | 0 |
| 1067.0 | 0 |
| 1066.0 | 0 |
| 1065.0 | 0 |
| 1064.0 | 0 |
| 1063.0 | 0 |
| 1062.0 | 0 |
| 1061.0 | 0 |
| 1060.0 | 0 |
| 1059.0 | 0 |
| 1058.0 | 0 |
| 1057.0 | 0 |
| 1056.0 | 0 |
| 1055.0 | 0 |
| 1054.0 | 0 |
| 1053.0 | 0 |
| 1052.0 | 0 |
| 1051.0 | 0 |
| 1050.0 | 0 |
| 1049.0 | 0 |
| 1048.0 | 0 |
| 1047.0 | 0 |
| 1046.0 | 0 |
| 1045.0 | 0 |
| 1044.0 | 0 |
| 1043.0 | 0 |
| 1042.0 | 0 |
| 1041.0 | 0 |
| 1040.0 | 0 |
| 1039.0 | 0 |
| 1038.0 | 0 |
| 1037.0 | 0 |
| 1036.0 | 0 |
| 1035.0 | 0 |
| 1034.0 | 0 |
| 1033.0 | 0 |
| 1032.0 | 0 |
| 1031.0 | 0 |
| 1030.0 | 0 |
| 1029.0 | 0 |
| 1028.0 | 0 |
| 1027.0 | 0 |
| 1026.0 | 0 |
| 1025.0 | 0 |
| 1024.0 | 0 |
| 1023.0 | 0 |
| 1022.0 | 0 |
| 1021.0 | 0 |
| 1020.0 | 0 |
| 1019.0 | 0 |
| 1018.0 | 0 |
| 1017.0 | 0 |
| 1016.0 | 0 |
| 1015.0 | 0 |
| 1014.0 | 0 |
| 1013.0 | 0 |
| 1012.0 | 0 |
| 1011.0 | 0 |
| 1010.0 | 0 |
| 1009.0 | 0 |
| 1008.0 | 0 |
| 1007.0 | 0 |
| 1006.0 | 0 |
| 1005.0 | 0 |
| 1004.0 | 0 |
| 1003.0 | 0 |
| 1002.0 | 0 |
| 1001.0 | 0 |
| 1000.0 | 0 |
| 999.0 | 0 |
| 998.0 | 0 |
| 997.0 | 0 |
| 996.0 | 0 |
| 995.0 | 0 |
| 994.0 | 0 |
| 993.0 | 0 |
| 992.0 | 0 |
| 991.0 | 0 |
| 990.0 | 0 |
| 989.0 | 0 |
| 988.0 | 0 |
| 987.0 | 0 |
| 986.0 | 0 |
| 985.0 | 0 |
| 984.0 | 0 |
| 983.0 | 0 |
| 982.0 | 0 |
| 981.0 | 0 |
| 980.0 | 0 |
| 979.0 | 0 |
| 978.0 | 0 |
| 977.0 | 0 |
| 976.0 | 0 |
| 975.0 | 0 |
| 974.0 | 0 |
| 973.0 | 0 |
| 972.0 | 0 |
| 971.0 | 0 |
| 970.0 | 0 |
| 969.0 | 0 |
| 968.0 | 0 |
| 967.0 | 0 |
| 966.0 | 0 |
| 965.0 | 0 |
| 964.0 | 0 |
| 963.0 | 0 |
| 962.0 | 0 |
| 961.0 | 0 |
| 960.0 | 0 |
| 959.0 | 0 |
| 958.0 | 0 |
| 957.0 | 0 |
| 956.0 | 0 |
| 955.0 | 0 |
| 954.0 | 0 |
| 953.0 | 0 |
| 952.0 | 0 |
| 951.0 | 0 |
| 950.0 | 0 |
| 949.0 | 0 |
| 948.0 | 0 |
| 947.0 | 0 |
| 946.0 | 0 |
| 945.0 | 0 |
| 944.0 | 0 |
| 943.0 | 0 |
| 942.0 | 0 |
| 941.0 | 0 |
| 940.0 | 0 |
| 939.0 | 0 |
| 938.0 | 0 |
| 937.0 | 0 |
| 936.0 | 0 |
| 935.0 | 0 |
| 934.0 | 0 |
| 933.0 | 0 |
| 932.0 | 0 |
| 931.0 | 0 |
| 930.0 | 0 |
| 929.0 | 0 |
| 928.0 | 0 |
| 927.0 | 0 |
| 926.0 | 0 |
| 925.0 | 0 |
| 924.0 | 0 |
| 923.0 | 0 |
| 922.0 | 0 |
| 921.0 | 0 |
| 920.0 | 0 |
| 919.0 | 0 |
| 918.0 | 0 |
| 917.0 | 0 |
| 916.0 | 0 |
| 915.0 | 0 |
| 914.0 | 0 |
| 913.0 | 0 |
| 912.0 | 0 |
| 911.0 | 0 |
| 910.0 | 0 |
| 909.0 | 0 |
| 908.0 | 0 |
| 907.0 | 0 |
| 906.0 | 0 |
| 905.0 | 0 |
| 904.0 | 0 |
| 903.0 | 0 |
| 902.0 | 0 |
| 901.0 | 0 |
| 900.0 | 0 |
| 899.0 | 0 |
| 898.0 | 0 |
| 897.0 | 0 |
| 896.0 | 0 |
| 895.0 | 0 |
| 894.0 | 0 |
| 893.0 | 0 |
| 892.0 | 0 |
| 891.0 | 0 |
| 890.0 | 0 |
| 889.0 | 0 |
| 888.0 | 0 |
| 887.0 | 0 |
| 886.0 | 0 |
| 885.0 | 0 |
| 884.0 | 0 |
| 883.0 | 0 |
| 882.0 | 0 |
| 881.0 | 0 |
| 880.0 | 0 |
| 879.0 | 0 |
| 878.0 | 0 |
| 877.0 | 0 |
| 876.0 | 0 |
| 875.0 | 0 |
| 874.0 | 0 |
| 873.0 | 0 |
| 872.0 | 0 |
| 871.0 | 0 |
| 870.0 | 0 |
| 869.0 | 0 |
| 868.0 | 0 |
| 867.0 | 0 |
| 866.0 | 0 |
| 865.0 | 0 |
| 864.0 | 0 |
| 863.0 | 0 |
| 862.0 | 0 |
| 861.0 | 0 |
| 860.0 | 0 |
| 859.0 | 0 |
| 858.0 | 0 |
| 857.0 | 0 |
| 856.0 | 0 |
| 855.0 | 0 |
| 854.0 | 0 |
| 853.0 | 0 |
| 852.0 | 0 |
| 851.0 | 0 |
| 850.0 | 0 |
| 849.0 | 0 |
| 848.0 | 0 |
| 847.0 | 0 |
| 846.0 | 0 |
| 845.0 | 0 |
| 844.0 | 0 |
| 843.0 | 0 |
| 842.0 | 0 |
| 841.0 | 0 |
| 840.0 | 0 |
| 839.0 | 0 |
| 838.0 | 0 |
| 837.0 | 0 |
| 836.0 | 0 |
| 835.0 | 0 |
| 834.0 | 0 |
| 833.0 | 0 |
| 832.0 | 0 |
| 831.0 | 0 |
| 830.0 | 0 |
| 829.0 | 0 |
| 828.0 | 0 |
| 827.0 | 0 |
| 826.0 | 0 |
| 825.0 | 0 |
| 824.0 | 0 |
| 823.0 | 0 |
| 822.0 | 0 |
| 821.0 | 0 |
| 820.0 | 0 |
| 819.0 | 0 |
| 818.0 | 0 |
| 817.0 | 0 |
| 816.0 | 0 |
| 815.0 | 0 |
| 814.0 | 0 |
| 813.0 | 0 |
| 812.0 | 0 |
| 811.0 | 0 |
| 810.0 | 0 |
| 809.0 | 0 |
| 808.0 | -0.001 |
| 807.0 | 0 |
| 806.0 | 0 |
| 805.0 | 0 |
| 804.0 | 0 |
| 803.0 | 0 |
| 802.0 | 0 |
| 801.0 | 0 |
| 800.0 | 0 |
| 799.0 | 0 |
| 798.0 | 0 |
| 797.0 | 0 |
| 796.0 | 0 |
| 795.0 | 0 |
| 794.0 | 0 |
| 793.0 | 0 |
| 792.0 | 0 |
| 791.0 | 0 |
| 790.0 | 0 |
| 789.0 | 0 |
| 788.0 | 0 |
| 787.0 | 0 |
| 786.0 | 0 |
| 785.0 | 0 |
| 784.0 | 0 |
| 783.0 | 0 |
| 782.0 | 0 |
| 781.0 | 0 |
| 780.0 | 0 |
| 779.0 | 0 |
| 778.0 | 0 |
| 777.0 | 0 |
| 776.0 | 0 |
| 775.0 | 0 |
| 774.0 | 0 |
| 773.0 | 0 |
| 772.0 | 0 |
| 771.0 | 0 |
| 770.0 | 0 |
| 769.0 | 0 |
| 768.0 | 0 |
| 767.0 | 0 |
| 766.0 | 0 |
| 765.0 | 0 |
| 764.0 | 0 |
| 763.0 | 0 |
| 762.0 | 0 |
| 761.0 | 0 |
| 760.0 | 0 |
| 759.0 | 0 |
| 758.0 | 0 |
| 757.0 | 0 |
| 756.0 | 0 |
| 755.0 | 0 |
| 754.0 | 0 |
| 753.0 | 0 |
| 752.0 | 0 |
| 751.0 | 0 |
| 750.0 | 0 |
| 749.0 | 0 |
| 748.0 | 0 |
| 747.0 | 0 |
| 746.0 | 0 |
| 745.0 | 0 |
| 744.0 | 0 |
| 743.0 | 0 |
| 742.0 | 0 |
| 741.0 | 0 |
| 740.0 | 0 |
| 739.0 | 0 |
| 738.0 | 0 |
| 737.0 | 0 |
| 736.0 | 0.001 |
| 735.0 | 0.001 |
| 734.0 | 0.001 |
| 733.0 | 0 |
| 732.0 | 0 |
| 731.0 | 0 |
| 730.0 | 0 |
| 729.0 | 0 |
| 728.0 | 0 |
| 727.0 | 0.001 |
| 726.0 | 0.002 |
| 725.0 | 0.003 |
| 724.0 | 0.003 |
| 723.0 | 0.002 |
| 722.0 | 0.001 |
| 721.0 | 0.001 |
| 720.0 | 0 |
| 719.0 | 0 |
| 718.0 | 0 |
| 717.0 | 0 |
| 716.0 | 0 |
| 715.0 | 0.001 |
| 714.0 | 0.001 |
| 713.0 | 0.001 |
| 712.0 | 0.001 |
| 711.0 | 0.002 |
| 710.0 | 0.001 |
| 709.0 | 0.001 |
| 708.0 | 0.001 |
| 707.0 | 0 |
| 706.0 | 0 |
| 705.0 | 0 |
| 704.0 | 0 |
| 703.0 | 0 |
| 702.0 | 0 |
| 701.0 | 0 |
| 700.0 | 0 |
| 699.0 | 0 |
| 698.0 | 0 |
| 697.0 | 0.001 |
| 696.0 | 0.001 |
| 695.0 | 0.001 |
| 694.0 | 0.001 |
| 693.0 | 0.001 |
| 692.0 | 0.001 |
| 691.0 | 0 |
| 690.0 | 0 |
| 689.0 | 0 |
| 688.0 | 0 |
| 687.0 | 0 |
| 686.0 | 0 |
| 685.0 | 0 |
| 684.0 | 0 |
| 683.0 | 0 |
| 682.0 | 0 |
| 681.0 | 0 |
| 680.0 | 0 |
| 679.0 | 0 |
| 678.0 | 0 |
| 677.0 | 0 |
| 676.0 | 0 |
| 675.0 | 0 |
| 674.0 | 0 |
| 673.0 | 0 |
| 672.0 | 0 |
| 671.0 | 0 |
| 670.0 | 0 |
| 669.0 | 0 |
| 668.0 | 0 |
| 667.0 | 0 |
| 666.0 | 0 |
| 665.0 | 0 |
| 664.0 | 0 |
| 663.0 | 0 |
| 662.0 | 0 |
| 661.0 | 0 |
| 660.0 | 0 |
| 659.0 | 0 |
| 658.0 | 0 |
| 657.0 | 0 |
| 656.0 | 0 |
| 655.0 | 0 |
| 654.0 | 0 |
| 653.0 | 0 |
| 652.0 | 0 |
| 651.0 | 0 |
| 650.0 | 0 |
| 649.0 | 0 |
| 648.0 | 0 |
| 647.0 | 0 |
| 646.0 | 0 |
| 645.0 | 0 |
| 644.0 | 0 |
| 643.0 | 0 |
| 642.0 | 0 |
| 641.0 | 0 |
| 640.0 | 0 |
| 639.0 | 0 |
| 638.0 | 0 |
| 637.0 | 0 |
| 636.0 | 0 |
| 635.0 | 0 |
| 634.0 | 0 |
| 633.0 | 0 |
| 632.0 | 0 |
| 631.0 | 0 |
| 630.0 | 0 |
| 629.0 | 0 |
| 628.0 | 0 |
| 627.0 | 0 |
| 626.0 | 0 |
| 625.0 | 0 |
| 624.0 | 0 |
| 623.0 | 0 |
| 622.0 | 0 |
| 621.0 | 0 |
| 620.0 | 0 |
| 619.0 | 0 |
| 618.0 | 0 |
| 617.0 | 0 |
| 616.0 | 0 |
| 615.0 | 0 |
| 614.0 | 0 |
| 613.0 | 0 |
| 612.0 | 0 |
| 611.0 | 0 |
| 610.0 | 0 |
| 609.0 | 0 |
| 608.0 | 0 |
| 607.0 | 0 |
| 606.0 | 0 |
| 605.0 | 0 |
| 604.0 | 0 |
| 603.0 | 0 |
| 602.0 | 0 |
| 601.0 | 0 |
| 600.0 | 0 |
| 599.0 | 0 |
| 598.0 | 0 |
| 597.0 | 0 |
| 596.0 | 0 |
| 595.0 | 0 |
| 594.0 | 0 |
| 593.0 | 0 |
| 592.0 | 0 |
| 591.0 | 0 |
| 590.0 | 0 |
| 589.0 | 0 |
| 588.0 | 0 |
| 587.0 | 0 |
| 586.0 | 0 |
| 585.0 | 0 |
| 584.0 | 0 |
| 583.0 | 0 |
| 582.0 | 0 |
| 581.0 | 0 |
| 580.0 | 0 |
| 579.0 | 0 |
| 578.0 | 0 |
| 577.0 | 0 |
| 576.0 | 0 |
| 575.0 | 0 |
| 574.0 | 0 |
| 573.0 | 0 |
| 572.0 | 0 |
| 571.0 | 0 |
| 570.0 | 0 |
| 569.0 | 0 |
| 568.0 | 0 |
| 567.0 | 0 |
| 566.0 | 0 |
| 565.0 | 0 |
| 564.0 | 0 |
| 563.0 | 0 |
| 562.0 | 0 |
| 561.0 | 0 |
| 560.0 | 0 |
| 559.0 | 0 |
| 558.0 | 0 |
| 557.0 | 0 |
| 556.0 | 0 |
| 555.0 | 0 |
| 554.0 | 0 |
| 553.0 | 0 |
| 552.0 | 0 |
| 551.0 | 0 |
| 550.0 | 0 |
| 549.0 | 0 |
| 548.0 | 0 |
| 547.0 | 0 |
| 546.0 | 0 |
| 545.0 | 0 |
| 544.0 | 0 |
| 543.0 | 0 |
| 542.0 | 0 |
| 541.0 | 0 |
| 540.0 | 0 |
| 539.0 | 0 |
| 538.0 | 0 |
| 537.0 | 0 |
| 536.0 | 0 |
| 535.0 | 0 |
| 534.0 | 0 |
| 533.0 | 0 |
| 532.0 | 0 |
| 531.0 | 0 |
| 530.0 | 0 |
| 529.0 | 0 |
| 528.0 | 0 |
| 527.0 | 0 |
| 526.0 | 0 |
| 525.0 | 0 |
| 524.0 | 0 |
| 523.0 | 0 |
| 522.0 | 0 |
| 521.0 | 0 |
| 520.0 | 0 |
| 519.0 | 0 |
| 518.0 | 0 |
| 517.0 | 0 |
| 516.0 | 0 |
| 515.0 | 0 |
| 514.0 | 0 |
| 513.0 | 0 |
| 512.0 | 0 |
| 511.0 | 0 |
| 510.0 | 0 |
| 509.0 | 0 |
| 508.0 | 0 |
| 507.0 | 0 |
| 506.0 | 0 |
| 505.0 | 0 |
| 504.0 | 0 |
| 503.0 | 0 |
| 502.0 | 0 |
| 501.0 | 0 |
| 500.0 | 0 |
| 499.0 | 0 |
| 498.0 | 0 |
| 497.0 | 0 |
| 496.0 | 0 |
| 495.0 | 0 |
| 494.0 | 0 |
| 493.0 | 0 |
| 492.0 | 0 |
| 491.0 | 0 |
| 490.0 | 0 |
| 489.0 | 0 |
| 488.0 | 0 |
| 487.0 | 0 |
| 486.0 | 0 |
| 485.0 | 0 |
| 484.0 | 0 |
| 483.0 | 0 |
| 482.0 | 0 |
| 481.0 | 0 |
| 480.0 | 0 |
| 479.0 | 0 |
| 478.0 | 0 |
| 477.0 | 0 |
| 476.0 | 0 |
| 475.0 | 0 |
| 474.0 | 0 |
| 473.0 | 0 |
| 472.0 | 0 |
| 471.0 | 0 |
| 470.0 | 0 |
| 469.0 | 0 |
| 468.0 | 0 |
| 467.0 | 0 |
| 466.0 | 0 |
| 465.0 | 0 |
| 464.0 | 0 |
| 463.0 | 0 |
| 462.0 | 0 |
| 461.0 | 0 |
| 460.0 | 0 |
| 459.0 | 0 |
| 458.0 | 0 |
| 457.0 | 0 |
| 456.0 | 0 |
| 455.0 | 0 |
| 454.0 | 0 |
| 453.0 | 0 |
| 452.0 | 0 |
| 451.0 | 0 |
| 450.0 | 0 |
| 449.0 | 0 |
| 448.0 | 0 |
| 447.0 | 0 |
| 446.0 | 0 |
| 445.0 | 0 |
| 444.0 | 0 |
| 443.0 | 0 |
| 442.0 | 0 |
| 441.0 | 0 |
| 440.0 | 0 |
| 439.0 | 0 |
| 438.0 | 0 |
| 437.0 | 0 |
| 436.0 | 0 |
| 435.0 | 0 |
| 434.0 | 0 |
| 433.0 | 0 |
| 432.0 | 0 |
| 431.0 | 0 |
| 430.0 | 0 |
| 429.0 | 0 |
| 428.0 | 0 |
| 427.0 | 0 |
| 426.0 | 0 |
| 425.0 | 0 |
| 424.0 | 0 |
| 423.0 | 0 |
| 422.0 | 0 |
| 421.0 | 0 |
| 420.0 | 0 |
| 419.0 | 0 |
| 418.0 | 0 |
| 417.0 | 0 |
| 416.0 | 0 |
| 415.0 | 0 |
| 414.0 | 0 |
| 413.0 | 0 |
| 412.0 | 0 |
| 411.0 | 0 |
| 410.0 | 0 |
| 409.0 | 0 |
| 408.0 | 0 |
| 407.0 | 0 |
| 406.0 | 0 |
| 405.0 | 0 |
| 404.0 | 0 |
| 403.0 | 0 |
| 402.0 | 0 |
| 401.0 | 0 |
| 400.0 | 0 |
| 399.0 | 0 |
| 398.0 | 0 |
| 397.0 | 0 |
| 396.0 | 0 |
| 395.0 | 0 |
| 394.0 | 0 |
| 393.0 | 0 |
| 392.0 | 0 |
| 391.0 | 0 |
| 390.0 | 0 |
| 389.0 | 0 |
| 388.0 | 0 |
| 387.0 | 0 |
| 386.0 | 0 |
| 385.0 | 0 |
| 384.0 | 0 |
| 383.0 | 0 |
| 382.0 | 0 |
| 381.0 | 0 |
| 380.0 | 0 |
| 379.0 | 0 |
| 378.0 | 0 |
| 377.0 | 0 |
| 376.0 | 0 |
| 375.0 | 0 |
| 374.0 | 0 |
| 373.0 | 0 |
| 372.0 | 0 |
| 371.0 | 0 |
| 370.0 | 0 |
| 369.0 | 0 |
| 368.0 | 0 |
| 367.0 | 0 |
| 366.0 | 0 |
| 365.0 | 0 |
| 364.0 | 0 |
| 363.0 | 0 |
| 362.0 | 0 |
| 361.0 | 0 |
| 360.0 | 0 |
| 359.0 | 0 |
| 358.0 | 0 |
| 357.0 | 0 |
| 356.0 | 0 |
| 355.0 | 0 |
| 354.0 | 0 |
| 353.0 | 0 |
| 352.0 | 0 |
| 351.0 | 0 |
| 350.0 | 0 |
| 349.0 | 0 |
| 348.0 | 0 |
| 347.0 | 0 |
| 346.0 | 0 |
| 345.0 | 0 |
| 344.0 | 0 |
| 343.0 | 0 |
| 342.0 | 0 |
| 341.0 | 0 |
| 340.0 | 0 |
| 339.0 | 0 |
| 338.0 | 0 |
| 337.0 | 0 |
| 336.0 | 0 |
| 335.0 | 0 |
| 334.0 | 0 |
| 333.0 | 0 |
| 332.0 | 0 |
| 331.0 | 0 |
| 330.0 | 0 |
| 329.0 | 0 |
| 328.0 | 0 |
| 327.0 | 0 |
| 326.0 | 0 |
| 325.0 | 0 |
| 324.0 | 0 |
| 323.0 | 0 |
| 322.0 | 0 |
| 321.0 | 0 |
| 320.0 | 0 |
| 319.0 | 0 |
| 318.0 | 0 |
| 317.0 | 0 |
| 316.0 | 0 |
| 315.0 | 0 |
| 314.0 | 0 |
| 313.0 | 0 |
| 312.0 | 0 |
| 311.0 | 0 |
| 310.0 | 0 |
| 309.0 | 0 |
| 308.0 | 0 |
| 307.0 | 0 |
| 306.0 | 0 |
| 305.0 | 0 |
| 304.0 | 0 |
| 303.0 | 0 |
| 302.0 | 0 |
| 301.0 | 0 |
| 300.0 | 0 |
| 299.0 | 0 |
| 298.0 | 0 |
| 297.0 | 0 |
| 296.0 | 0 |
| 295.0 | 0 |
| 294.0 | 0 |
| 293.0 | 0 |
| 292.0 | 0 |
| 291.0 | 0 |
| 290.0 | 0 |
| 289.0 | 0 |
| 288.0 | 0 |
| 287.0 | 0 |
| 286.0 | 0 |
| 285.0 | 0 |
| 284.0 | 0 |
| 283.0 | 0 |
| 282.0 | 0 |
| 281.0 | 0 |
| 280.0 | 0 |
| 279.0 | 0 |
| 278.0 | 0 |
| 277.0 | 0 |
| 276.0 | 0 |
| 275.0 | 0 |
| 274.0 | 0 |
| 273.0 | 0 |
| 272.0 | 0 |
| 271.0 | 0 |
| 270.0 | 0 |
| 269.0 | 0 |
| 268.0 | 0 |
| 267.0 | 0 |
| 266.0 | 0 |
| 265.0 | 0 |
| 264.0 | 0 |
| 263.0 | 0 |
| 262.0 | 0 |
| 261.0 | 0 |
| 260.0 | 0 |
| 259.0 | 0 |
| 258.0 | 0 |
| 257.0 | 0 |
| 256.0 | 0 |
| 255.0 | 0 |
| 254.0 | 0 |
| 253.0 | 0 |
| 252.0 | 0 |
| 251.0 | 0 |
| 250.0 | 0 |
| 249.0 | 0 |
| 248.0 | 0 |
| 247.0 | 0 |
| 246.0 | 0 |
| 245.0 | 0 |
| 244.0 | 0 |
| 243.0 | 0 |
| 242.0 | 0 |
| 241.0 | 0 |
| 240.0 | 0 |
| 239.0 | 0 |
| 238.0 | 0 |
| 237.0 | 0 |
| 236.0 | 0 |
| 235.0 | 0 |
| 234.0 | 0 |
| 233.0 | 0 |
| 232.0 | 0 |
| 231.0 | 0 |
| 230.0 | 0 |
| 229.0 | 0 |
| 228.0 | 0 |
| 227.0 | 0 |
| 226.0 | 0 |
| 225.0 | 0 |
| 224.0 | 0 |
| 223.0 | 0 |
| 222.0 | 0 |
| 221.0 | 0 |
| 220.0 | 0 |
| 219.0 | 0 |
| 218.0 | 0 |
| 217.0 | 0 |
| 216.0 | 0 |